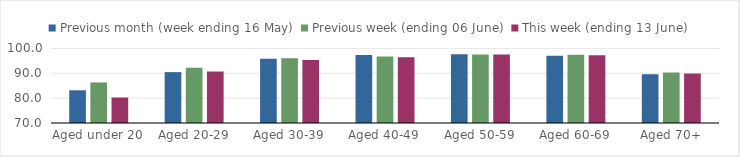
| Category | Previous month (week ending 16 May) | Previous week (ending 06 June) | This week (ending 13 June) |
|---|---|---|---|
| Aged under 20 | 83.16 | 86.314 | 80.256 |
| Aged 20-29 | 90.47 | 92.251 | 90.707 |
| Aged 30-39 | 95.866 | 96.095 | 95.335 |
| Aged 40-49 | 97.365 | 96.728 | 96.408 |
| Aged 50-59 | 97.689 | 97.535 | 97.526 |
| Aged 60-69 | 97.037 | 97.421 | 97.281 |
| Aged 70+ | 89.624 | 90.308 | 89.904 |